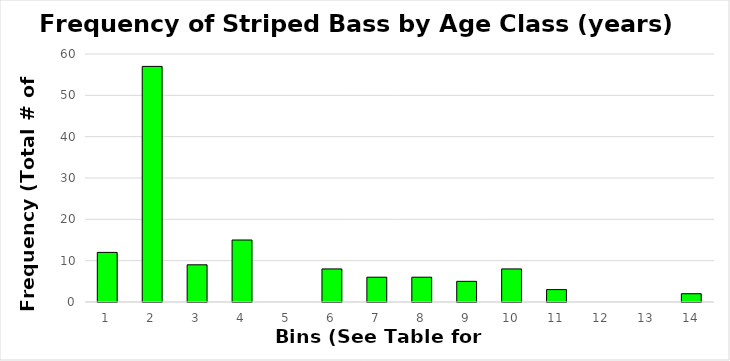
| Category | Series 0 |
|---|---|
| 0 | 12 |
| 1 | 57 |
| 2 | 9 |
| 3 | 15 |
| 4 | 0 |
| 5 | 8 |
| 6 | 6 |
| 7 | 6 |
| 8 | 5 |
| 9 | 8 |
| 10 | 3 |
| 11 | 0 |
| 12 | 0 |
| 13 | 2 |